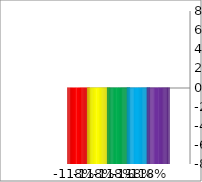
| Category | Series 0 |
|---|---|
| 0 | -1.176 |
| 1 | -1.176 |
| 2 | -1.176 |
| 3 | -1.176 |
| 4 | -1.176 |